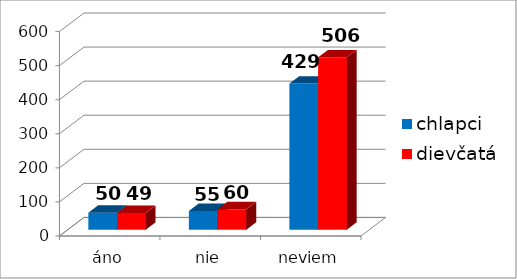
| Category | chlapci | dievčatá |
|---|---|---|
| áno | 50 | 49 |
| nie | 55 | 60 |
| neviem | 429 | 506 |